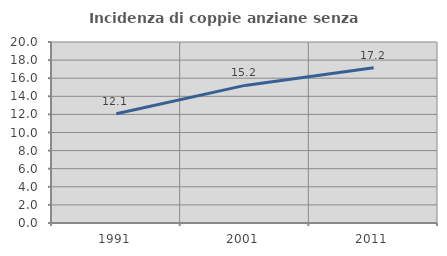
| Category | Incidenza di coppie anziane senza figli  |
|---|---|
| 1991.0 | 12.069 |
| 2001.0 | 15.204 |
| 2011.0 | 17.158 |